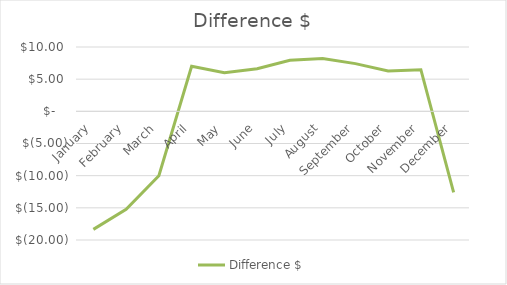
| Category | Difference $ |
|---|---|
| January | -18.35 |
| February | -15.223 |
| March | -10.012 |
| April | 7 |
| May | 6.001 |
| June | 6.633 |
| July | 7.949 |
| August | 8.217 |
| September | 7.418 |
| October | 6.288 |
| November | 6.468 |
| December | -12.608 |